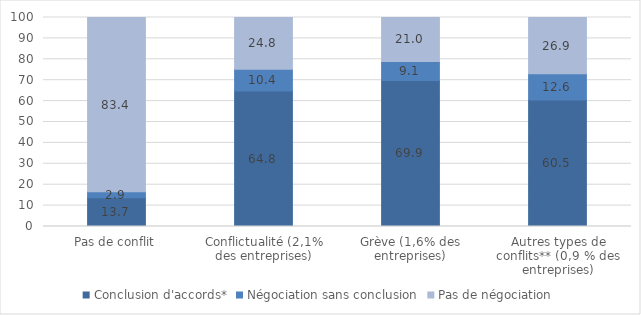
| Category | Conclusion d'accords* | Négociation sans conclusion | Pas de négociation |
|---|---|---|---|
| Pas de conflit | 13.7 | 2.9 | 83.4 |
| Conflictualité (2,1% des entreprises) | 64.8 | 10.4 | 24.8 |
| Grève (1,6% des entreprises) | 69.9 | 9.1 | 21 |
| Autres types de conflits** (0,9 % des entreprises) | 60.5 | 12.6 | 26.9 |